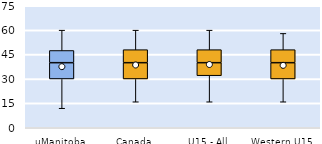
| Category | 25th | 50th | 75th |
|---|---|---|---|
| uManitoba | 30 | 10 | 7.5 |
| Canada | 30 | 10 | 8 |
| U15 - All | 32 | 8 | 8 |
| Western U15 | 30 | 10 | 8 |